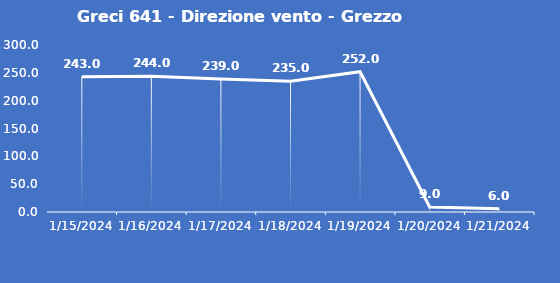
| Category | Greci 641 - Direzione vento - Grezzo (°N) |
|---|---|
| 1/15/24 | 243 |
| 1/16/24 | 244 |
| 1/17/24 | 239 |
| 1/18/24 | 235 |
| 1/19/24 | 252 |
| 1/20/24 | 9 |
| 1/21/24 | 6 |